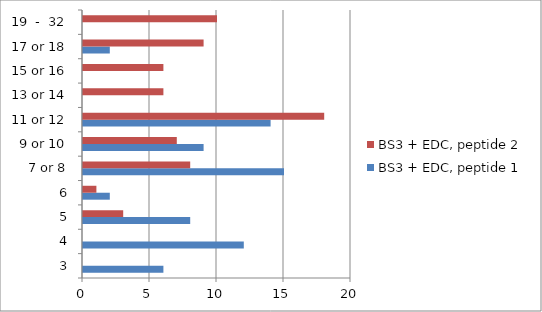
| Category | BS3 + EDC, peptide 1 | BS3 + EDC, peptide 2 |
|---|---|---|
| 3 | 6 | 0 |
| 4 | 12 | 0 |
| 5 | 8 | 3 |
| 6 | 2 | 1 |
| 7 or 8 | 15 | 8 |
| 9 or 10 | 9 | 7 |
| 11 or 12 | 14 | 18 |
| 13 or 14 | 0 | 6 |
| 15 or 16 | 0 | 6 |
| 17 or 18 | 2 | 9 |
| 19  -  32 | 0 | 10 |